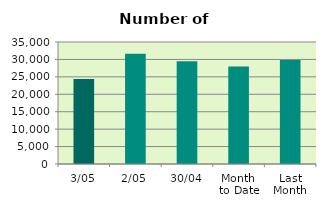
| Category | Series 0 |
|---|---|
| 3/05 | 24380 |
| 2/05 | 31628 |
| 30/04 | 29468 |
| Month 
to Date | 28004 |
| Last
Month | 29833 |